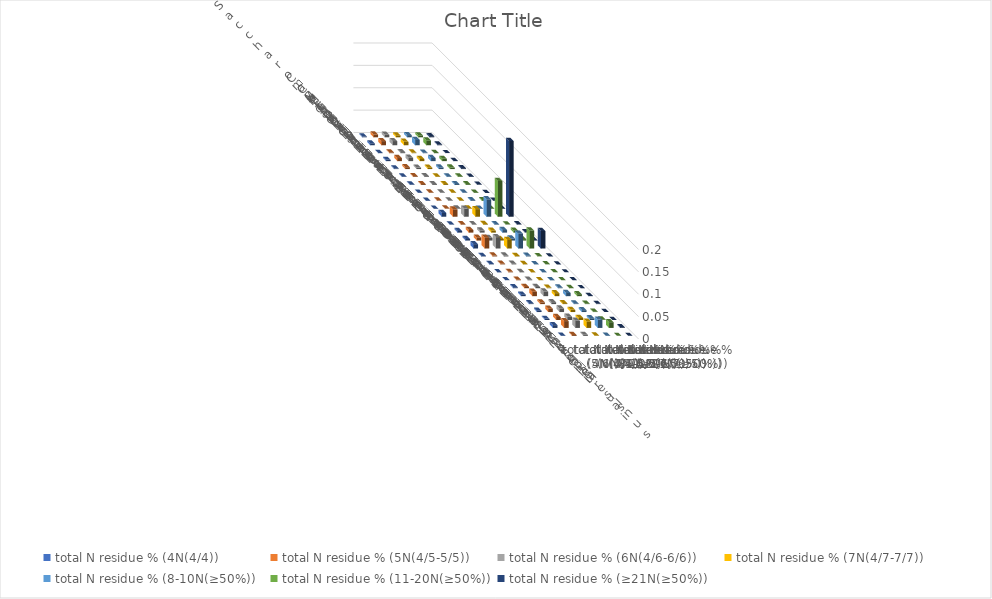
| Category | total N residue % (4N(4/4)) | total N residue % (5N(4/5-5/5)) | total N residue % (6N(4/6-6/6)) | total N residue % (7N(4/7-7/7)) | total N residue % (8-10N(≥50%)) | total N residue % (11-20N(≥50%)) | total N residue % (≥21N(≥50%)) |
|---|---|---|---|---|---|---|---|
| Saccharomyces cerevisiae S288c | 0.002 | 0.006 | 0.006 | 0.004 | 0.005 | 0.004 | 0.002 |
| Candida albicans | 0.004 | 0.009 | 0.009 | 0.008 | 0.012 | 0.011 | 0.002 |
| Candida auris | 0.001 | 0.002 | 0.002 | 0.001 | 0.001 | 0.001 | 0 |
| Candida tropicalis | 0.003 | 0.007 | 0.008 | 0.005 | 0.007 | 0.005 | 0 |
| Neurospora crassa | 0.002 | 0.004 | 0.003 | 0.003 | 0.004 | 0.003 | 0.002 |
| Magnaporthe oryzae | 0.001 | 0.002 | 0.002 | 0.001 | 0.001 | 0.001 | 0.001 |
| Trichoderma reesei | 0.001 | 0.002 | 0.002 | 0.002 | 0.002 | 0.002 | 0.001 |
| Cryptococcus neoformans | 0.001 | 0.001 | 0.001 | 0.001 | 0.001 | 0.001 | 0 |
| Ustilago maydis | 0 | 0.001 | 0.001 | 0.001 | 0.002 | 0.002 | 0 |
| Taiwanofungus camphoratus | 0 | 0.001 | 0.001 | 0.001 | 0 | 0 | 0 |
| Dictyostelium discoideum | 0.008 | 0.017 | 0.018 | 0.017 | 0.039 | 0.08 | 0.169 |
| Chlamydomonas reinhardtii | 0.001 | 0.001 | 0.001 | 0.001 | 0.001 | 0.001 | 0.001 |
| Drosophila melanogaster | 0.004 | 0.006 | 0.005 | 0.004 | 0.006 | 0.004 | 0.001 |
| Aedes aegypti | 0.004 | 0.007 | 0.006 | 0.003 | 0.005 | 0.003 | 0.001 |
| Plasmodium falciparum | 0.01 | 0.024 | 0.025 | 0.019 | 0.033 | 0.04 | 0.039 |
| Caenorhabditis elegans | 0.001 | 0.002 | 0.002 | 0.001 | 0.002 | 0.001 | 0 |
| Danio rerio | 0.001 | 0.001 | 0.002 | 0.001 | 0 | 0 | 0 |
| Mus musculus | 0 | 0.001 | 0.001 | 0 | 0 | 0 | 0 |
| Homo sapiens | 0 | 0.001 | 0.001 | 0 | 0 | 0 | 0 |
| Arabidopsis thaliana | 0.002 | 0.003 | 0.003 | 0.001 | 0.002 | 0.001 | 0 |
| Tetrahymena thermophila | 0.003 | 0.01 | 0.01 | 0.007 | 0.007 | 0.004 | 0.001 |
| Paramecium tetraurelia | 0.002 | 0.004 | 0.004 | 0.002 | 0.001 | 0.001 | 0.001 |
| Oxytricha trifallax | 0.003 | 0.007 | 0.008 | 0.005 | 0.004 | 0.001 | 0 |
| Stylonychia lemnae | 0.003 | 0.007 | 0.007 | 0.004 | 0.004 | 0.001 | 0 |
| Pseudocohnilembus persalinus | 0.006 | 0.015 | 0.016 | 0.014 | 0.019 | 0.013 | 0.002 |
| Stentor coeruleus | 0.001 | 0.002 | 0.002 | 0.001 | 0 | 0 | 0 |